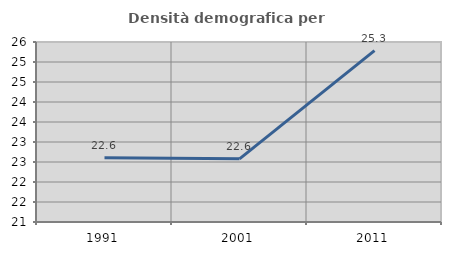
| Category | Densità demografica |
|---|---|
| 1991.0 | 22.609 |
| 2001.0 | 22.579 |
| 2011.0 | 25.284 |